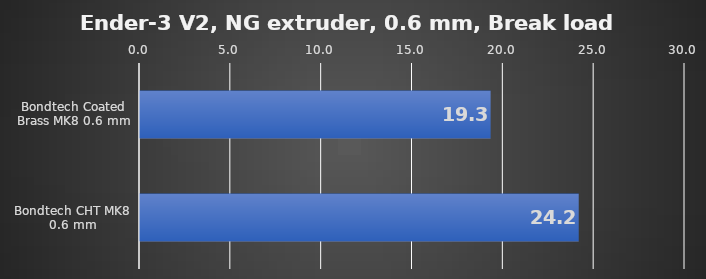
| Category | Average |
|---|---|
| Bondtech Coated Brass MK8 0.6 mm | 19.3 |
| Bondtech CHT MK8 0.6 mm | 24.15 |